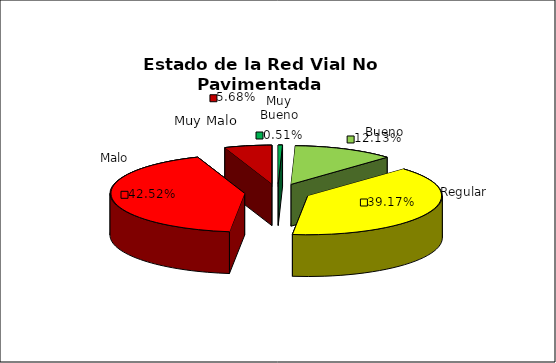
| Category | Series 0 |
|---|---|
| 0 | 0.005 |
| 1 | 0.121 |
| 2 | 0.392 |
| 3 | 0.425 |
| 4 | 0.057 |